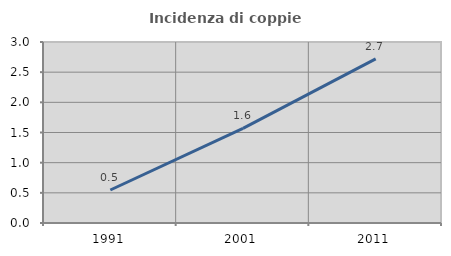
| Category | Incidenza di coppie miste |
|---|---|
| 1991.0 | 0.547 |
| 2001.0 | 1.569 |
| 2011.0 | 2.719 |